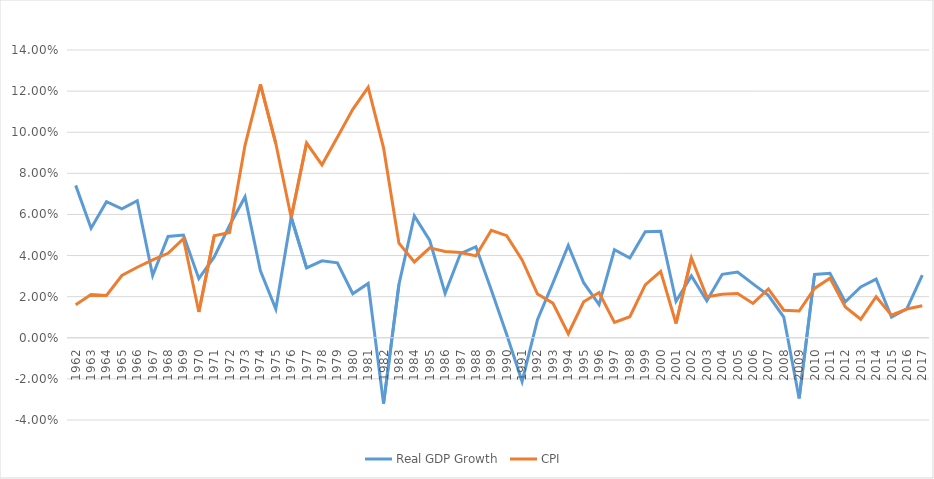
| Category | Real GDP Growth | CPI  |
|---|---|---|
| 1962.0 | 0.074 | 0.016 |
| 1963.0 | 0.053 | 0.021 |
| 1964.0 | 0.066 | 0.021 |
| 1965.0 | 0.063 | 0.03 |
| 1966.0 | 0.067 | 0.034 |
| 1967.0 | 0.03 | 0.038 |
| 1968.0 | 0.049 | 0.041 |
| 1969.0 | 0.05 | 0.048 |
| 1970.0 | 0.029 | 0.013 |
| 1971.0 | 0.039 | 0.05 |
| 1972.0 | 0.055 | 0.051 |
| 1973.0 | 0.069 | 0.094 |
| 1974.0 | 0.033 | 0.123 |
| 1975.0 | 0.014 | 0.095 |
| 1976.0 | 0.059 | 0.058 |
| 1977.0 | 0.034 | 0.095 |
| 1978.0 | 0.037 | 0.084 |
| 1979.0 | 0.036 | 0.098 |
| 1980.0 | 0.021 | 0.111 |
| 1981.0 | 0.026 | 0.122 |
| 1982.0 | -0.032 | 0.092 |
| 1983.0 | 0.026 | 0.046 |
| 1984.0 | 0.059 | 0.037 |
| 1985.0 | 0.047 | 0.044 |
| 1986.0 | 0.022 | 0.042 |
| 1987.0 | 0.041 | 0.042 |
| 1988.0 | 0.044 | 0.04 |
| 1989.0 | 0.023 | 0.052 |
| 1990.0 | 0.002 | 0.05 |
| 1991.0 | -0.021 | 0.038 |
| 1992.0 | 0.009 | 0.021 |
| 1993.0 | 0.027 | 0.017 |
| 1994.0 | 0.045 | 0.002 |
| 1995.0 | 0.027 | 0.018 |
| 1996.0 | 0.016 | 0.022 |
| 1997.0 | 0.043 | 0.007 |
| 1998.0 | 0.039 | 0.01 |
| 1999.0 | 0.052 | 0.026 |
| 2000.0 | 0.052 | 0.032 |
| 2001.0 | 0.018 | 0.007 |
| 2002.0 | 0.03 | 0.039 |
| 2003.0 | 0.018 | 0.02 |
| 2004.0 | 0.031 | 0.021 |
| 2005.0 | 0.032 | 0.022 |
| 2006.0 | 0.026 | 0.017 |
| 2007.0 | 0.021 | 0.024 |
| 2008.0 | 0.01 | 0.013 |
| 2009.0 | -0.03 | 0.013 |
| 2010.0 | 0.031 | 0.024 |
| 2011.0 | 0.031 | 0.029 |
| 2012.0 | 0.017 | 0.015 |
| 2013.0 | 0.025 | 0.009 |
| 2014.0 | 0.029 | 0.02 |
| 2015.0 | 0.01 | 0.011 |
| 2016.0 | 0.014 | 0.014 |
| 2017.0 | 0.03 | 0.016 |